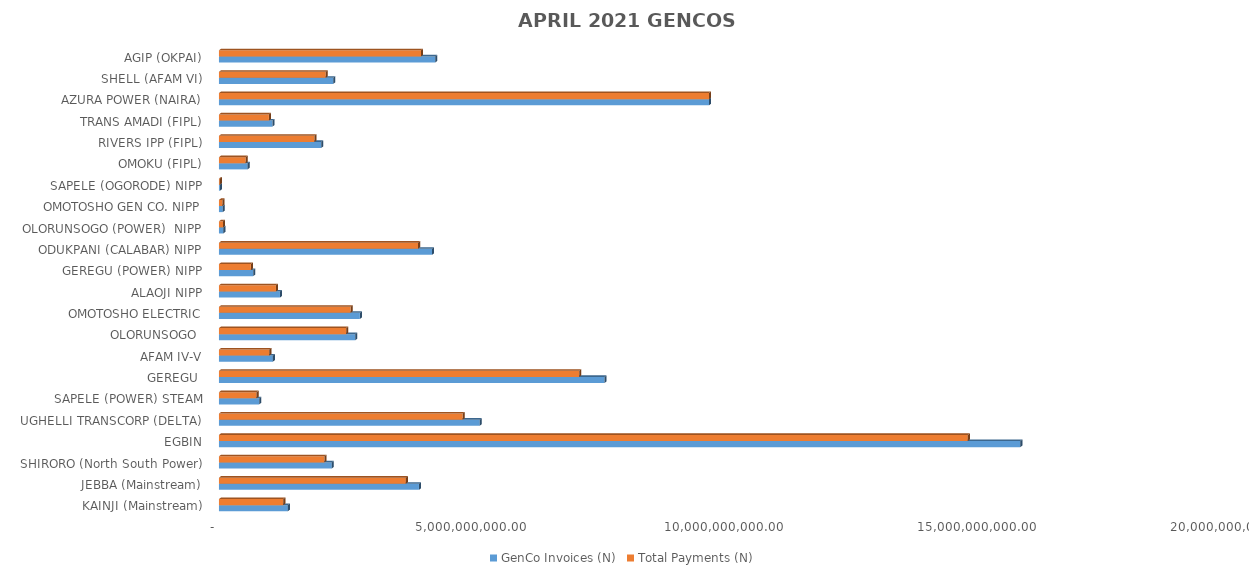
| Category | GenCo Invoices (N) | Total Payments (N) |
|---|---|---|
| KAINJI (Mainstream) | 1362228358.68 | 1272995624.249 |
| JEBBA (Mainstream) | 3954183857.04 | 3695165142.77 |
| SHIRORO (North South Power) | 2230822440.65 | 2084692472.689 |
| EGBIN | 15845137678.99 | 14807202333.182 |
| UGHELLI TRANSCORP (DELTA) | 5156997472.96 | 4819188482.981 |
| SAPELE (POWER) STEAM | 795424929.25 | 743320639.232 |
| GEREGU  | 7621828737.97 | 7122561037.865 |
| AFAM IV-V | 1065878925.07 | 996058552.846 |
| OLORUNSOGO  | 2693823954.49 | 2517365083.99 |
| OMOTOSHO ELECTRIC | 2786532193.84 | 2604000472.449 |
| ALAOJI NIPP | 1206129229.61 | 1127121764.709 |
| GEREGU (POWER) NIPP | 675702520.91 | 631440644.244 |
| ODUKPANI (CALABAR) NIPP | 4212887206.92 | 3936922136.212 |
| OLORUNSOGO (POWER)  NIPP | 86338467.28 | 80682868.149 |
| OMOTOSHO GEN CO. NIPP | 75564833.52 | 70614960.998 |
| SAPELE (OGORODE) NIPP | 19252175.41 | 17991062.143 |
| OMOKU (FIPL) | 565777977.07 | 528716704.888 |
| RIVERS IPP (FIPL) | 2020638701.48 | 1888276814.076 |
| TRANS AMADI (FIPL) | 1057026330.65 | 987785847.402 |
| AZURA POWER (NAIRA) | 9690083229.2 | 9690083228.318 |
| SHELL (AFAM VI) | 2259142157.385 | 2111157107.09 |
| AGIP (OKPAI) | 4275595494.159 | 3995522718.67 |